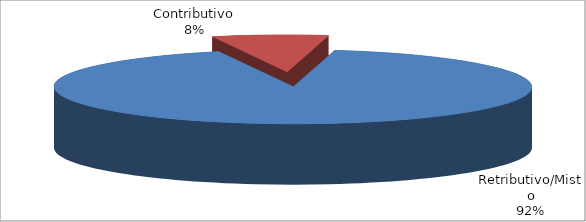
| Category | Series 1 |
|---|---|
| Retributivo/Misto | 288191 |
| Contributivo | 24474 |